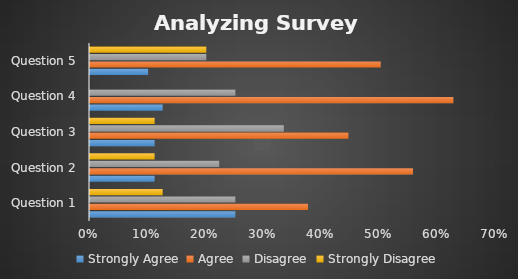
| Category | Strongly Agree | Agree | Disagree | Strongly Disagree |
|---|---|---|---|---|
| Question 1 | 0.25 | 0.375 | 0.25 | 0.125 |
| Question 2 | 0.111 | 0.556 | 0.222 | 0.111 |
| Question 3 | 0.111 | 0.444 | 0.333 | 0.111 |
| Question 4 | 0.125 | 0.625 | 0.25 | 0 |
| Question 5 | 0.1 | 0.5 | 0.2 | 0.2 |